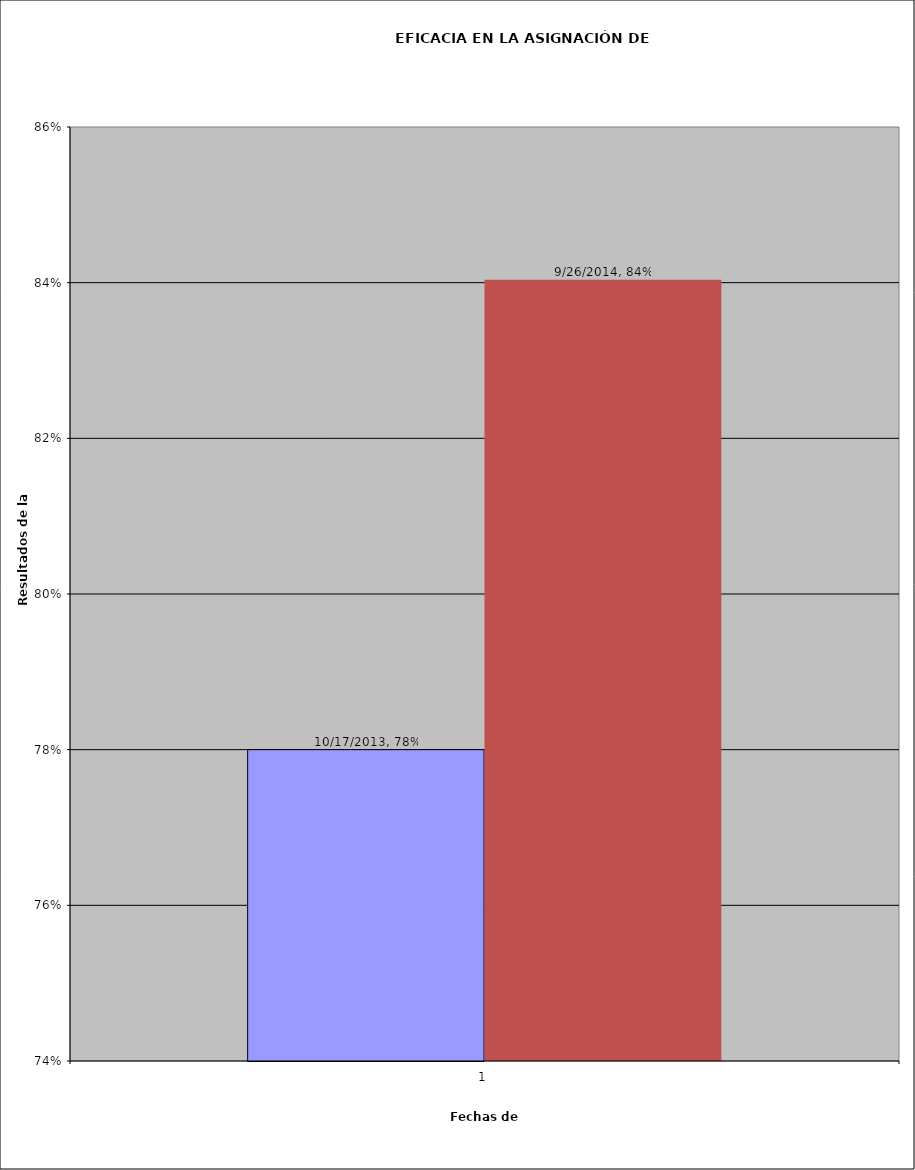
| Category | 17/10/2013 | 26/09/2014 |
|---|---|---|
| 0 | 0.78 | 0.84 |